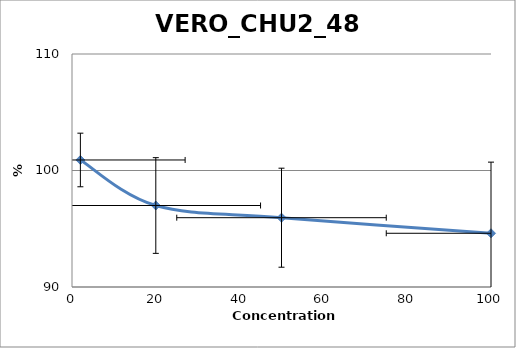
| Category | vero chu2 |
|---|---|
| 100.0 | 94.611 |
| 50.0 | 95.948 |
| 20.0 | 96.995 |
| 2.0 | 100.903 |
| nan | 0 |
| nan | 0 |
| nan | 0 |
| nan | 0 |
| nan | 0 |